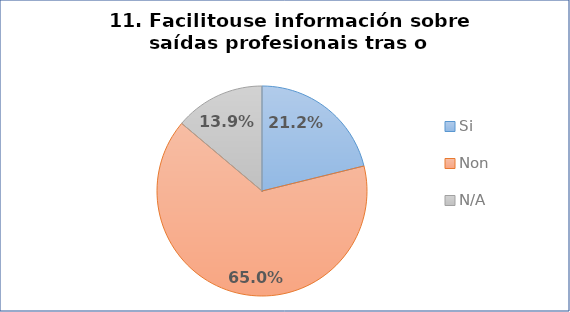
| Category | Pregunta 11. Facilitouse información sobre saídas profesionais tras o doutoramento |
|---|---|
| Si | 0.212 |
| Non | 0.65 |
| N/A | 0.139 |